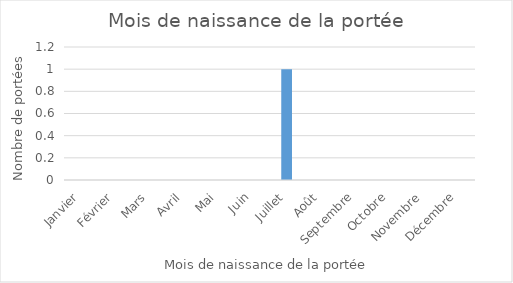
| Category | Series 0 |
|---|---|
| Janvier | 0 |
| Février | 0 |
| Mars | 0 |
| Avril | 0 |
| Mai | 0 |
| Juin | 0 |
| Juillet | 1 |
| Août | 0 |
| Septembre | 0 |
| Octobre | 0 |
| Novembre | 0 |
| Décembre | 0 |